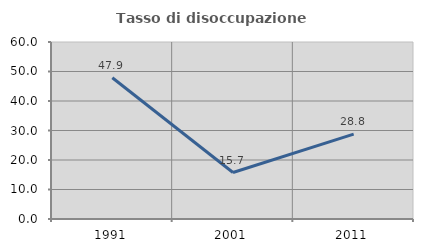
| Category | Tasso di disoccupazione giovanile  |
|---|---|
| 1991.0 | 47.887 |
| 2001.0 | 15.748 |
| 2011.0 | 28.758 |